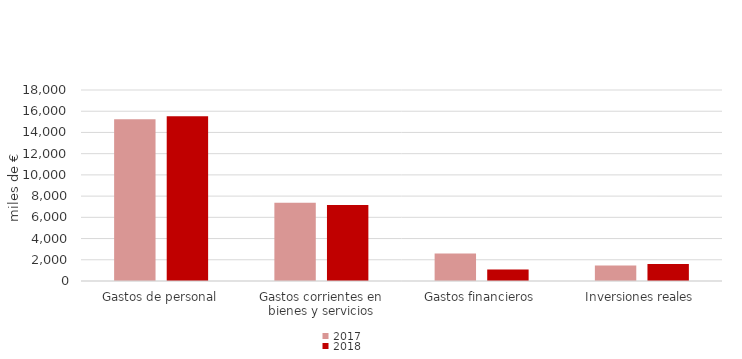
| Category | 2017 | 2018 |
|---|---|---|
| Gastos de personal | 15246.703 | 15527.24 |
| Gastos corrientes en bienes y servicios | 7380.318 | 7173.79 |
| Gastos financieros | 2593.466 | 1082.38 |
| Inversiones reales | 1449.233 | 1596.02 |